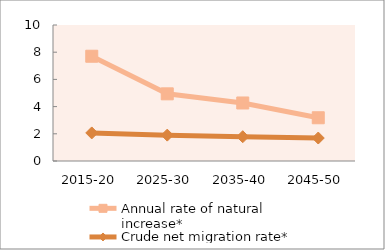
| Category | Annual rate of natural increase* | Crude net migration rate* |
|---|---|---|
| 2015-20 | 7.703 | 2.064 |
| 2025-30 | 4.938 | 1.902 |
| 2035-40 | 4.266 | 1.785 |
| 2045-50 | 3.18 | 1.689 |